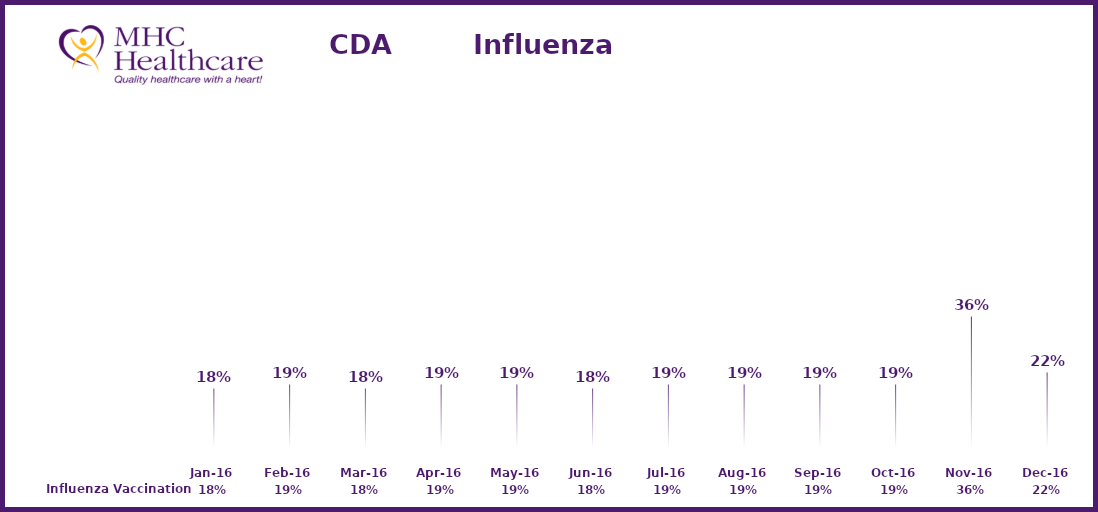
| Category | Influenza Vaccination |
|---|---|
| 2016-01-01 | 0.18 |
| 2016-02-01 | 0.19 |
| 2016-03-01 | 0.18 |
| 2016-04-01 | 0.19 |
| 2016-05-01 | 0.19 |
| 2016-06-01 | 0.18 |
| 2016-07-01 | 0.19 |
| 2016-08-01 | 0.19 |
| 2016-09-01 | 0.19 |
| 2016-10-01 | 0.19 |
| 2016-11-01 | 0.36 |
| 2016-12-01 | 0.22 |